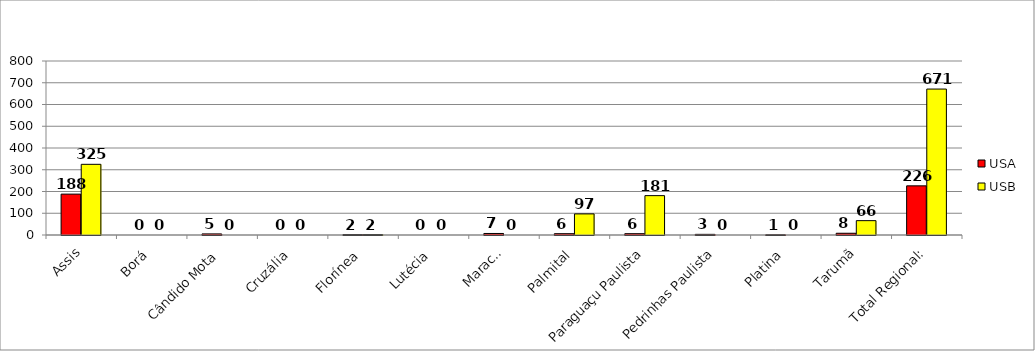
| Category | USA | USB |
|---|---|---|
| Assis | 188 | 325 |
| Borá | 0 | 0 |
| Cândido Mota | 5 | 0 |
| Cruzália | 0 | 0 |
| Florínea | 2 | 2 |
| Lutécia | 0 | 0 |
| Maracaí | 7 | 0 |
| Palmital | 6 | 97 |
| Paraguaçu Paulista | 6 | 181 |
| Pedrinhas Paulista | 3 | 0 |
| Platina | 1 | 0 |
| Tarumã | 8 | 66 |
| Total Regional: | 226 | 671 |